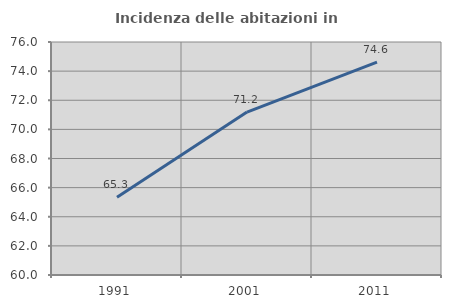
| Category | Incidenza delle abitazioni in proprietà  |
|---|---|
| 1991.0 | 65.338 |
| 2001.0 | 71.188 |
| 2011.0 | 74.612 |